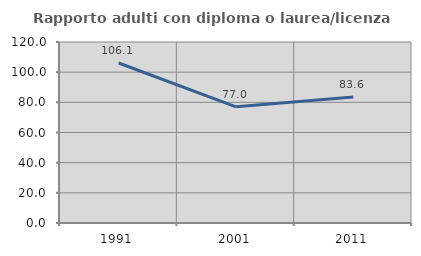
| Category | Rapporto adulti con diploma o laurea/licenza media  |
|---|---|
| 1991.0 | 106.061 |
| 2001.0 | 77.049 |
| 2011.0 | 83.582 |